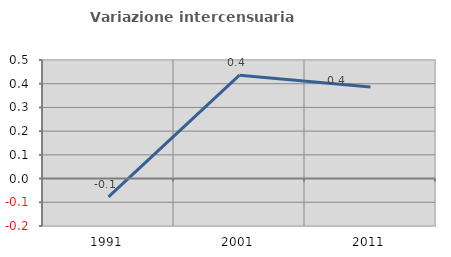
| Category | Variazione intercensuaria annua |
|---|---|
| 1991.0 | -0.077 |
| 2001.0 | 0.436 |
| 2011.0 | 0.386 |